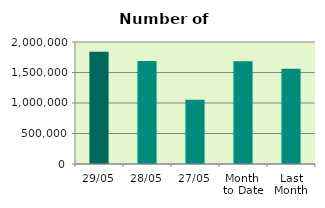
| Category | Series 0 |
|---|---|
| 29/05 | 1841750 |
| 28/05 | 1687306 |
| 27/05 | 1054696 |
| Month 
to Date | 1683517.5 |
| Last
Month | 1561575.6 |